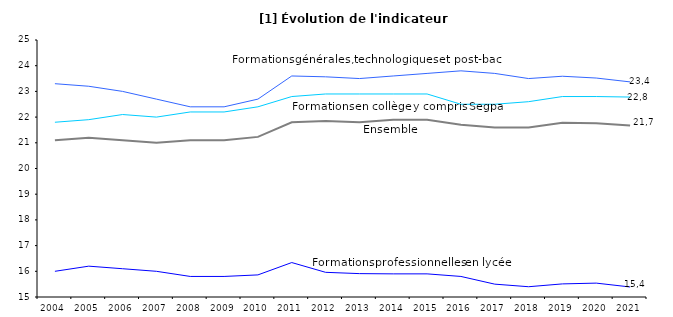
| Category | Formations en collège y compris Segpa | Formations professionnelles en lycée | Formations générales et technologiques et post-bac en lycée | Ensemble |
|---|---|---|---|---|
| 2004.0 | 21.8 | 16 | 23.3 | 21.1 |
| 2005.0 | 21.9 | 16.2 | 23.2 | 21.2 |
| 2006.0 | 22.1 | 16.1 | 23 | 21.1 |
| 2007.0 | 22 | 16 | 22.7 | 21 |
| 2008.0 | 22.2 | 15.8 | 22.4 | 21.1 |
| 2009.0 | 22.2 | 15.8 | 22.4 | 21.1 |
| 2010.0 | 22.4 | 15.86 | 22.7 | 21.23 |
| 2011.0 | 22.8 | 16.34 | 23.6 | 21.8 |
| 2012.0 | 22.9 | 15.96 | 23.567 | 21.85 |
| 2013.0 | 22.9 | 15.91 | 23.5 | 21.8 |
| 2014.0 | 22.9 | 15.9 | 23.6 | 21.9 |
| 2015.0 | 22.9 | 15.9 | 23.7 | 21.9 |
| 2016.0 | 22.5 | 15.8 | 23.8 | 21.7 |
| 2017.0 | 22.5 | 15.5 | 23.7 | 21.6 |
| 2018.0 | 22.6 | 15.4 | 23.5 | 21.6 |
| 2019.0 | 22.8 | 15.51 | 23.59 | 21.78 |
| 2020.0 | 22.8 | 15.54 | 23.52 | 21.76 |
| 2021.0 | 22.78 | 15.39 | 23.37 | 21.67 |